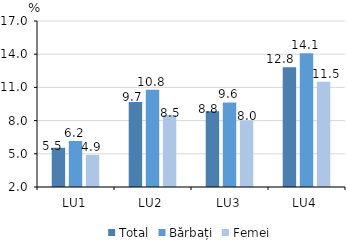
| Category | Total | Bărbați | Femei |
|---|---|---|---|
| LU1 | 5.545 | 6.159 | 4.901 |
| LU2 | 9.672 | 10.778 | 8.51 |
| LU3 | 8.847 | 9.637 | 8.015 |
| LU4 | 12.829 | 14.085 | 11.505 |